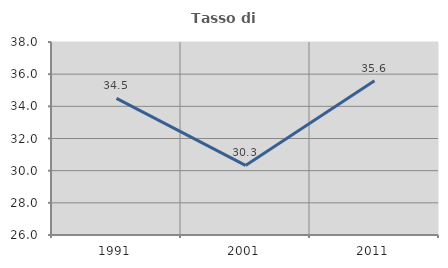
| Category | Tasso di occupazione   |
|---|---|
| 1991.0 | 34.497 |
| 2001.0 | 30.326 |
| 2011.0 | 35.591 |